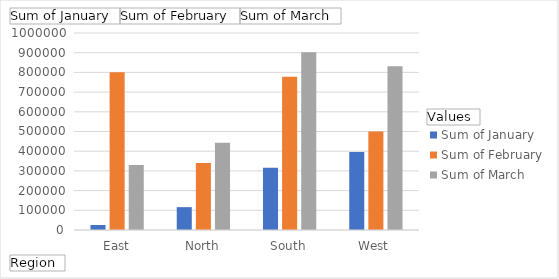
| Category | Sum of January | Sum of February | Sum of March |
|---|---|---|---|
| East | 25304 | 800648 | 330504 |
| North | 115943 | 340439 | 442846 |
| South | 315415 | 777825 | 902132 |
| West | 395459 | 500308 | 831089 |